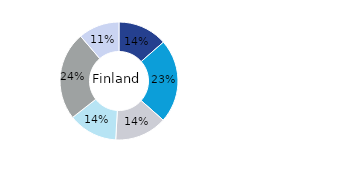
| Category | Finland |
|---|---|
| Kontor | 0.136 |
| Bostäder | 0.23 |
| Handel | 0.144 |
| Logistik* | 0.135 |
| Samhällsfastigheter | 0.243 |
| Övrigt | 0.113 |